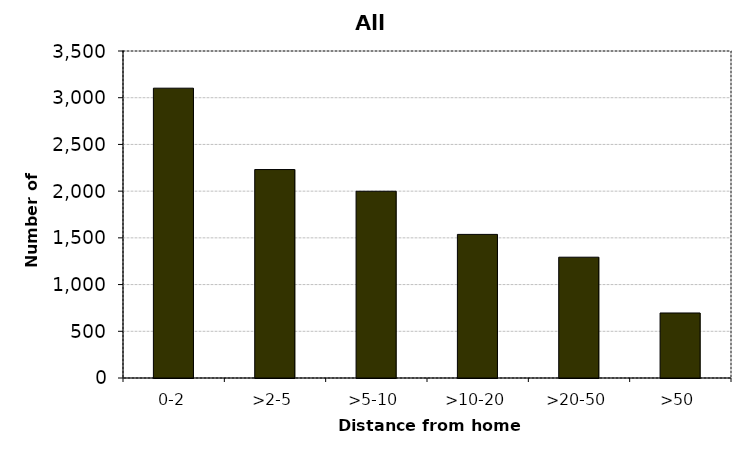
| Category | All drivers |
|---|---|
| 0-2 | 3102 |
| >2-5 | 2231 |
| >5-10 | 1999 |
| >10-20 | 1537 |
| >20-50 | 1293 |
| >50 | 696 |